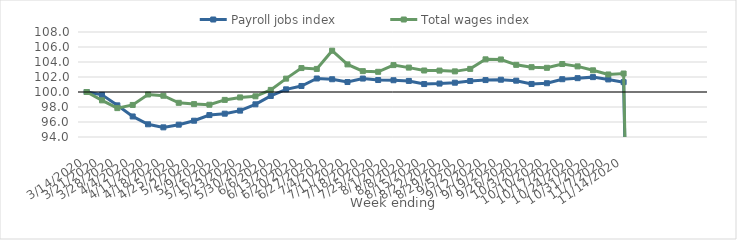
| Category | Payroll jobs index | Total wages index |
|---|---|---|
| 14/03/2020 | 100 | 100 |
| 21/03/2020 | 99.616 | 98.887 |
| 28/03/2020 | 98.22 | 97.85 |
| 04/04/2020 | 96.739 | 98.273 |
| 11/04/2020 | 95.696 | 99.667 |
| 18/04/2020 | 95.286 | 99.502 |
| 25/04/2020 | 95.643 | 98.556 |
| 02/05/2020 | 96.172 | 98.384 |
| 09/05/2020 | 96.924 | 98.304 |
| 16/05/2020 | 97.11 | 98.947 |
| 23/05/2020 | 97.515 | 99.277 |
| 30/05/2020 | 98.36 | 99.427 |
| 06/06/2020 | 99.47 | 100.279 |
| 13/06/2020 | 100.356 | 101.783 |
| 20/06/2020 | 100.803 | 103.191 |
| 27/06/2020 | 101.799 | 103.078 |
| 04/07/2020 | 101.701 | 105.507 |
| 11/07/2020 | 101.33 | 103.68 |
| 18/07/2020 | 101.793 | 102.78 |
| 25/07/2020 | 101.596 | 102.692 |
| 01/08/2020 | 101.568 | 103.586 |
| 08/08/2020 | 101.479 | 103.253 |
| 15/08/2020 | 101.06 | 102.868 |
| 22/08/2020 | 101.124 | 102.854 |
| 29/08/2020 | 101.239 | 102.751 |
| 05/09/2020 | 101.463 | 103.082 |
| 12/09/2020 | 101.59 | 104.354 |
| 19/09/2020 | 101.638 | 104.338 |
| 26/09/2020 | 101.51 | 103.62 |
| 03/10/2020 | 101.074 | 103.31 |
| 10/10/2020 | 101.17 | 103.225 |
| 17/10/2020 | 101.705 | 103.73 |
| 24/10/2020 | 101.845 | 103.415 |
| 31/10/2020 | 101.983 | 102.89 |
| 07/11/2020 | 101.676 | 102.339 |
| 14/11/2020 | 101.312 | 102.466 |